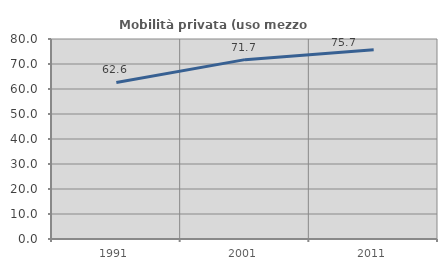
| Category | Mobilità privata (uso mezzo privato) |
|---|---|
| 1991.0 | 62.626 |
| 2001.0 | 71.741 |
| 2011.0 | 75.747 |